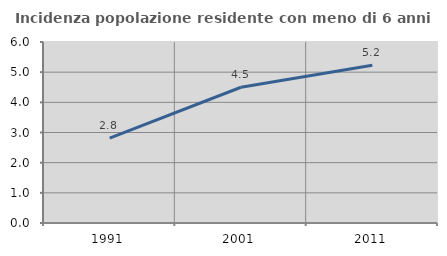
| Category | Incidenza popolazione residente con meno di 6 anni |
|---|---|
| 1991.0 | 2.811 |
| 2001.0 | 4.5 |
| 2011.0 | 5.229 |